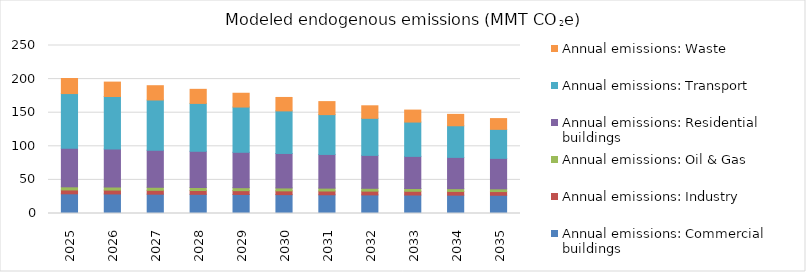
| Category | Annual emissions: Commercial buildings | Annual emissions: Industry | Annual emissions: Oil & Gas | Annual emissions: Residential buildings | Annual emissions: Transport | Annual emissions: Waste |
|---|---|---|---|---|---|---|
| 2025.0 | 29.281 | 5.783 | 4.639 | 57.557 | 81.231 | 22.368 |
| 2026.0 | 29.083 | 5.761 | 4.58 | 56.547 | 78.103 | 21.457 |
| 2027.0 | 28.768 | 5.738 | 4.52 | 55.039 | 74.835 | 21.259 |
| 2028.0 | 28.545 | 5.715 | 4.46 | 53.859 | 71.236 | 20.953 |
| 2029.0 | 28.328 | 5.69 | 4.4 | 52.671 | 67.322 | 20.53 |
| 2030.0 | 28.049 | 5.658 | 4.34 | 51.301 | 63.336 | 19.994 |
| 2031.0 | 27.853 | 5.635 | 4.28 | 50.134 | 59.241 | 19.357 |
| 2032.0 | 27.676 | 5.608 | 4.22 | 48.987 | 55.146 | 18.639 |
| 2033.0 | 27.495 | 5.577 | 4.159 | 47.775 | 51.053 | 17.822 |
| 2034.0 | 27.321 | 5.541 | 4.099 | 46.558 | 47.043 | 16.942 |
| 2035.0 | 27.159 | 5.498 | 4.038 | 45.356 | 43.165 | 16.012 |